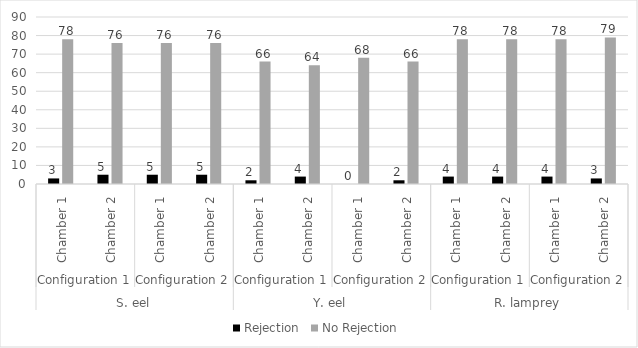
| Category | Rejection | No Rejection |
|---|---|---|
| 0 | 3 | 78 |
| 1 | 5 | 76 |
| 2 | 5 | 76 |
| 3 | 5 | 76 |
| 4 | 2 | 66 |
| 5 | 4 | 64 |
| 6 | 0 | 68 |
| 7 | 2 | 66 |
| 8 | 4 | 78 |
| 9 | 4 | 78 |
| 10 | 4 | 78 |
| 11 | 3 | 79 |